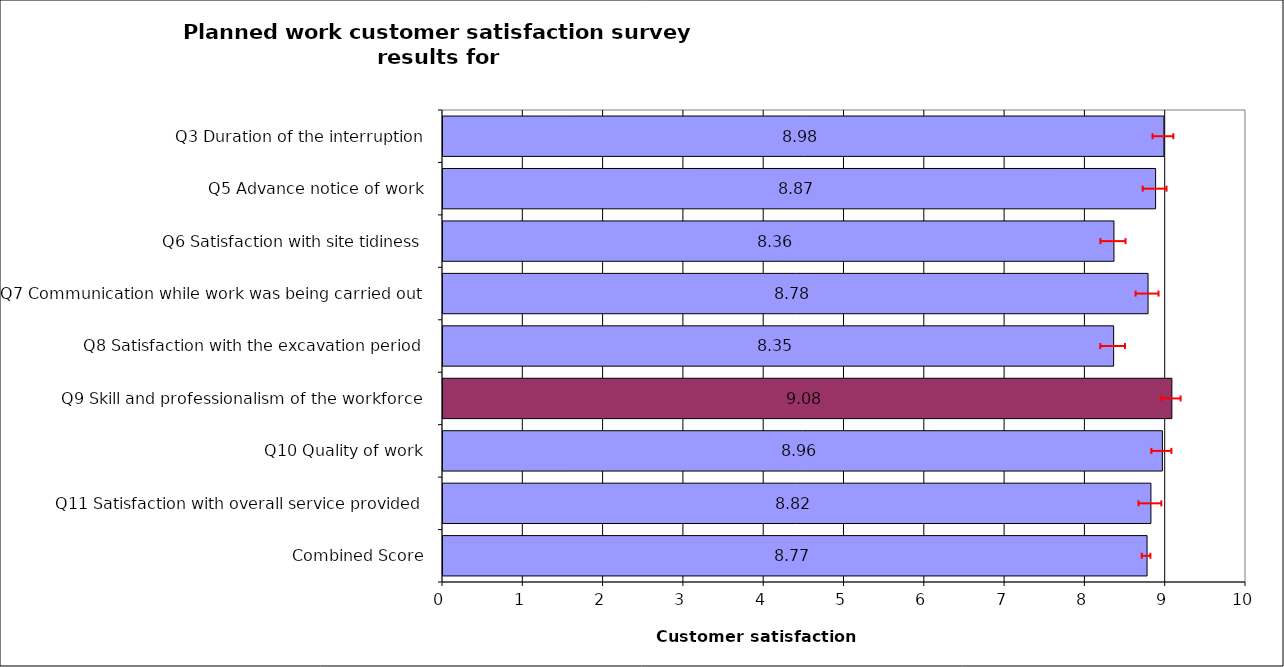
| Category | Series 0 |
|---|---|
| Q3 Duration of the interruption | 8.978 |
| Q5 Advance notice of work | 8.874 |
| Q6 Satisfaction with site tidiness | 8.356 |
| Q7 Communication while work was being carried out | 8.78 |
| Q8 Satisfaction with the excavation period | 8.352 |
| Q9 Skill and professionalism of the workforce | 9.077 |
| Q10 Quality of work | 8.959 |
| Q11 Satisfaction with overall service provided | 8.816 |
| Combined Score | 8.768 |